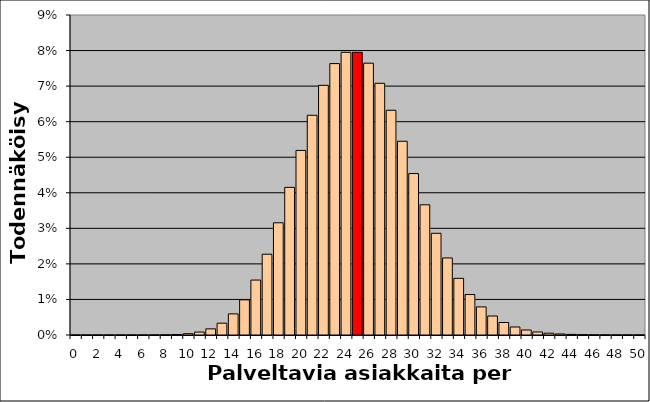
| Category | Series 1 |
|---|---|
| 0.0 | 0 |
| 1.0 | 0 |
| 2.0 | 0 |
| 3.0 | 0 |
| 4.0 | 0 |
| 5.0 | 0 |
| 6.0 | 0 |
| 7.0 | 0 |
| 8.0 | 0 |
| 9.0 | 0 |
| 10.0 | 0 |
| 11.0 | 0.001 |
| 12.0 | 0.002 |
| 13.0 | 0.003 |
| 14.0 | 0.006 |
| 15.0 | 0.01 |
| 16.0 | 0.015 |
| 17.0 | 0.023 |
| 18.0 | 0.032 |
| 19.0 | 0.042 |
| 20.0 | 0.052 |
| 21.0 | 0.062 |
| 22.0 | 0.07 |
| 23.0 | 0.076 |
| 24.0 | 0.08 |
| 25.0 | 0.08 |
| 26.0 | 0.076 |
| 27.0 | 0.071 |
| 28.0 | 0.063 |
| 29.0 | 0.054 |
| 30.0 | 0.045 |
| 31.0 | 0.037 |
| 32.0 | 0.029 |
| 33.0 | 0.022 |
| 34.0 | 0.016 |
| 35.0 | 0.011 |
| 36.0 | 0.008 |
| 37.0 | 0.005 |
| 38.0 | 0.004 |
| 39.0 | 0.002 |
| 40.0 | 0.001 |
| 41.0 | 0.001 |
| 42.0 | 0.001 |
| 43.0 | 0 |
| 44.0 | 0 |
| 45.0 | 0 |
| 46.0 | 0 |
| 47.0 | 0 |
| 48.0 | 0 |
| 49.0 | 0 |
| 50.0 | 0 |